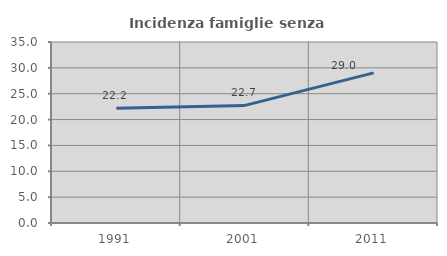
| Category | Incidenza famiglie senza nuclei |
|---|---|
| 1991.0 | 22.204 |
| 2001.0 | 22.744 |
| 2011.0 | 29.027 |